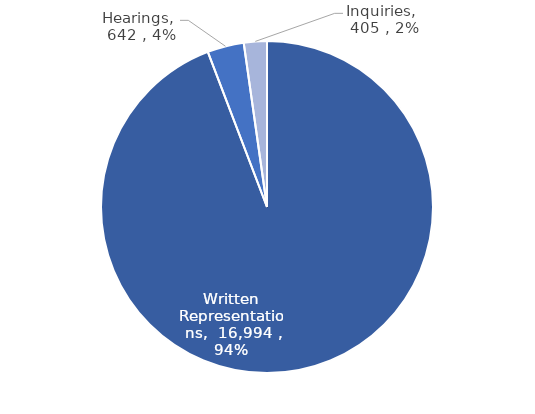
| Category | Series 0 |
|---|---|
| Written Representations | 16994 |
| Hearings | 642 |
| Inquiries | 405 |